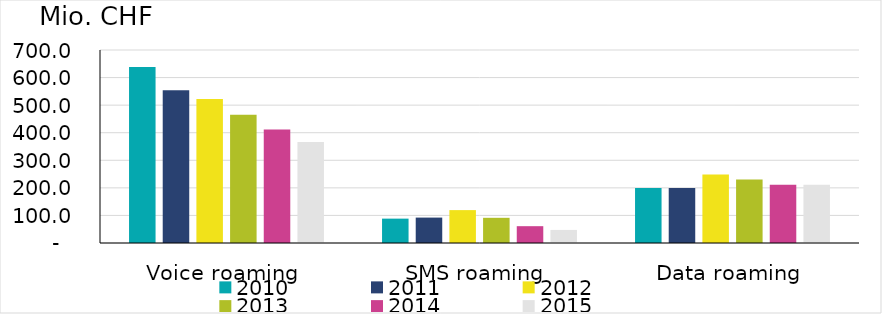
| Category | 2010 | 2011 | 2012 | 2013 | 2014 | 2015 |
|---|---|---|---|---|---|---|
| Voice roaming | 638.374 | 553.668 | 522.689 | 464.834 | 411.566 | 365.936 |
| SMS roaming | 88.383 | 92.169 | 119.294 | 91.344 | 61.011 | 47.347 |
| Data roaming | 199.16 | 199.573 | 248.416 | 230.172 | 211.707 | 211.605 |